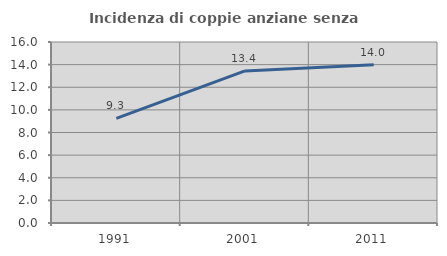
| Category | Incidenza di coppie anziane senza figli  |
|---|---|
| 1991.0 | 9.254 |
| 2001.0 | 13.443 |
| 2011.0 | 13.981 |